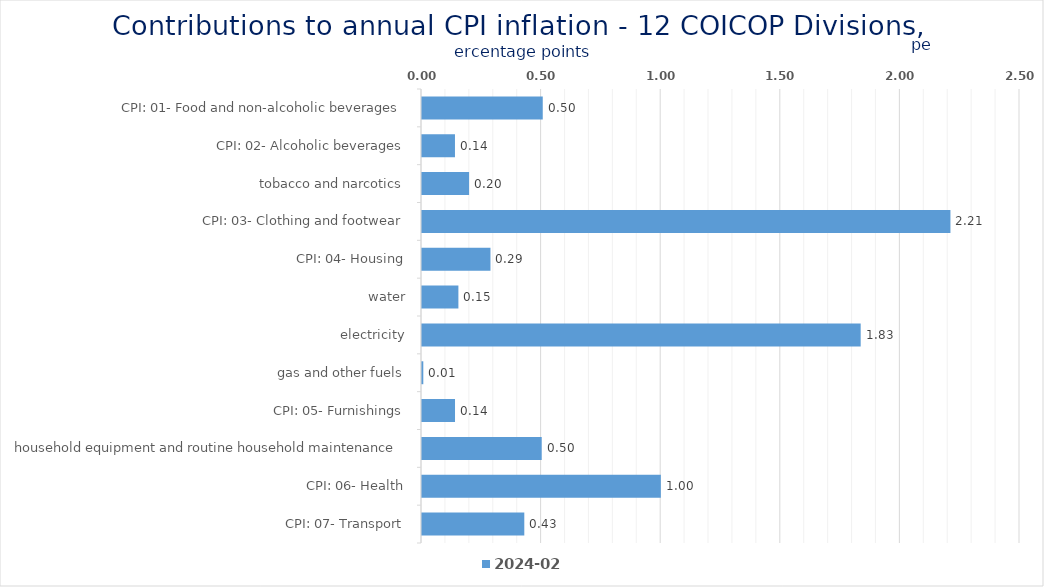
| Category | 2024-02 |
|---|---|
| CPI: 01- Food and non-alcoholic beverages | 0.505 |
| CPI: 02- Alcoholic beverages, tobacco and narcotics | 0.138 |
| CPI: 03- Clothing and footwear | 0.197 |
| CPI: 04- Housing, water, electricity, gas and other fuels | 2.209 |
| CPI: 05- Furnishings, household equipment and routine household maintenance | 0.286 |
| CPI: 06- Health | 0.152 |
| CPI: 07- Transport | 1.834 |
| CPI: 08- Communication | 0.005 |
| CPI: 09- Recreation and culture | 0.138 |
| CPI: 10- Education | 0.5 |
| CPI: 11- Restaurants and hotels | 0.998 |
| CPI: 12- Miscellaneous goods and services | 0.428 |